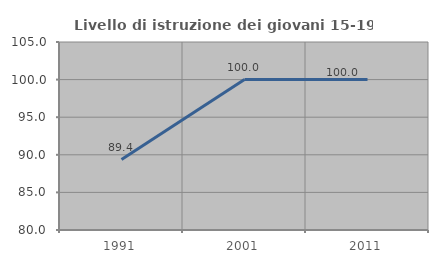
| Category | Livello di istruzione dei giovani 15-19 anni |
|---|---|
| 1991.0 | 89.362 |
| 2001.0 | 100 |
| 2011.0 | 100 |